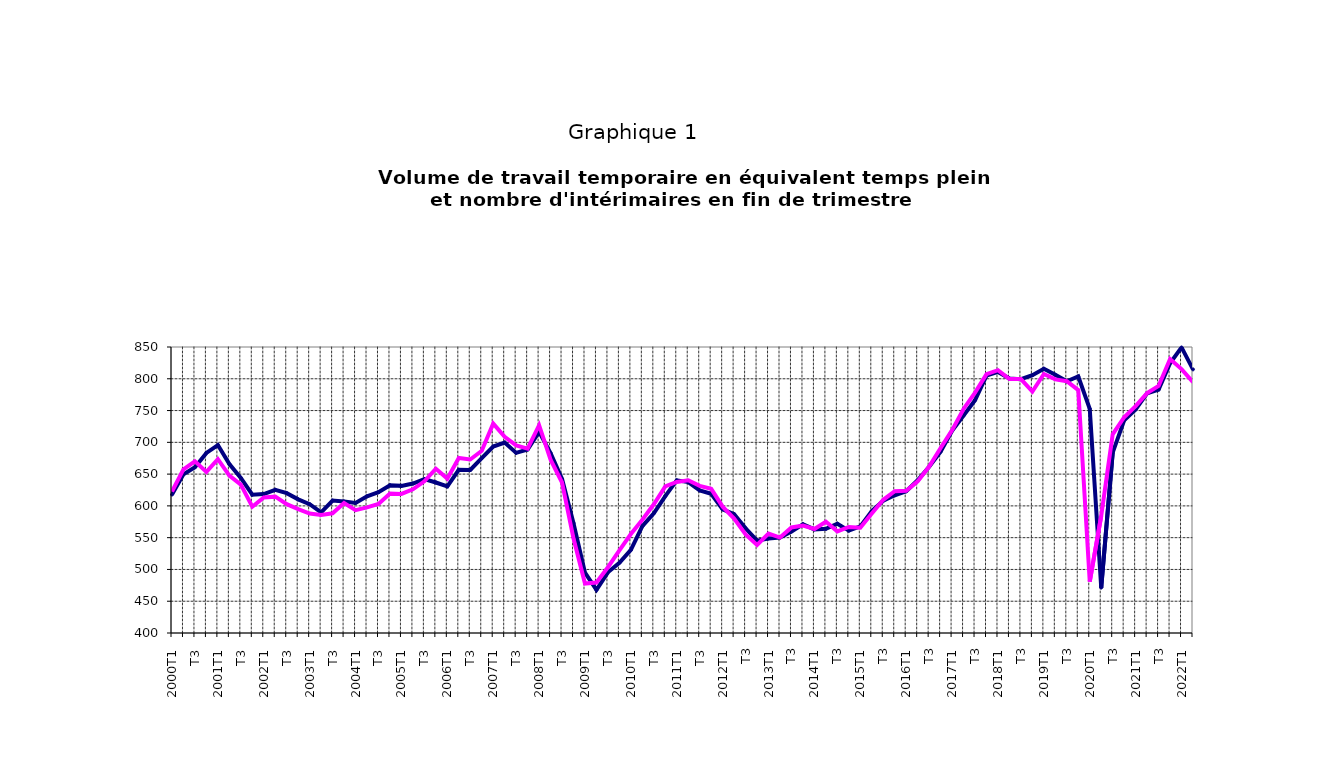
| Category | EETP | int |
|---|---|---|
| 2000T1 | 617.86 | 622.594 |
|      T2 | 649.628 | 657.411 |
|      T3 | 660.936 | 670.235 |
|      T4 | 683.328 | 653.452 |
| 2001T1 | 695.673 | 673.54 |
|      T2 | 665.833 | 647.568 |
|      T3 | 644.017 | 633.511 |
|      T4 | 617.552 | 598.655 |
| 2002T1 | 618.693 | 613.226 |
|      T2 | 625.339 | 614.538 |
|      T3 | 620.01 | 602.771 |
|      T4 | 610.335 | 594.948 |
| 2003T1 | 602.705 | 587.88 |
|      T2 | 589.744 | 585.855 |
|      T3 | 608.377 | 588.311 |
|      T4 | 606.798 | 604.404 |
| 2004T1 | 604.602 | 593.289 |
|      T2 | 615.069 | 597.707 |
|      T3 | 621.546 | 603.032 |
|      T4 | 632.583 | 619.458 |
| 2005T1 | 631.498 | 618.799 |
|      T2 | 635.203 | 626.101 |
|      T3 | 642.025 | 638.721 |
|      T4 | 636.831 | 658.508 |
| 2006T1 | 630.746 | 642.896 |
|      T2 | 656.841 | 675.389 |
|      T3 | 656.545 | 673.041 |
|      T4 | 675.18 | 686.787 |
| 2007T1 | 693.286 | 729.471 |
|      T2 | 699.708 | 708.656 |
|      T3 | 683.405 | 695.265 |
|      T4 | 688.679 | 690.036 |
| 2008T1 | 716.386 | 726.971 |
|      T2 | 682.999 | 672.678 |
|      T3 | 642.416 | 636.835 |
|      T4 | 572.775 | 548.528 |
| 2009T1 | 494.917 | 477.746 |
|      T2 | 467.723 | 479.358 |
|      T3 | 495.527 | 503.51 |
|      T4 | 510.436 | 529.932 |
| 2010T1 | 530.764 | 555.728 |
|      T2 | 568.04 | 578.294 |
|      T3 | 588.388 | 602.514 |
|      T4 | 615.3 | 630.776 |
| 2011T1 | 640.2 | 637.614 |
|      T2 | 637.48 | 640.323 |
|      T3 | 624.247 | 631.492 |
|      T4 | 619.03 | 626.889 |
| 2012T1 | 594.684 | 598.802 |
|      T2 | 587.158 | 579.966 |
| T3 | 564.813 | 554.968 |
| T4 | 545.302 | 538.454 |
| 2013T1 | 548.758 | 556.431 |
| T2 | 550.082 | 550.115 |
| T3 | 559.522 | 566.09 |
| T4 | 571.104 | 569.02 |
| 2014T1 | 563 | 563.671 |
| T2 | 563.936 | 574.972 |
| T3 | 572.028 | 559.876 |
| T4 | 561.077 | 566.843 |
| 2015T1 | 567.814 | 565.632 |
| T2 | 591.788 | 587.988 |
| T3 | 608 | 609.533 |
| T4 | 616.646 | 623.222 |
| 2016T1 | 622.979 | 623.825 |
| T2 | 640.322 | 638.555 |
| T3 | 661.711 | 661.939 |
| T4 | 685.35 | 691.128 |
| 2017T1 | 718.172 | 719.089 |
| T2 | 742.069 | 752.479 |
| T3 | 766.153 | 778.345 |
| T4 | 804.954 | 807.147 |
| 2018T1 | 810.817 | 813.457 |
| T2 | 800.528 | 799.593 |
| T3 | 799.459 | 799.57 |
| T4 | 805.723 | 779.923 |
| 2019T1 | 815.724 | 807.559 |
| T2 | 806.233 | 799.01 |
| T3 | 796.015 | 796.157 |
| T4 | 803.577 | 782.134 |
| 2020T1 | 752.649 | 480.935 |
| T2 | 471.426 | 584.294 |
| T3 | 683.726 | 712.577 |
| T4 | 734.566 | 739.544 |
| 2021T1 | 751.602 | 757.029 |
| T2 | 777.004 | 777.452 |
| T3 | 783.106 | 788.754 |
| T4 | 824.377 | 831.064 |
| 2022T1 | 849.36 | 815.237 |
| T2 | 814.812 | 794.688 |